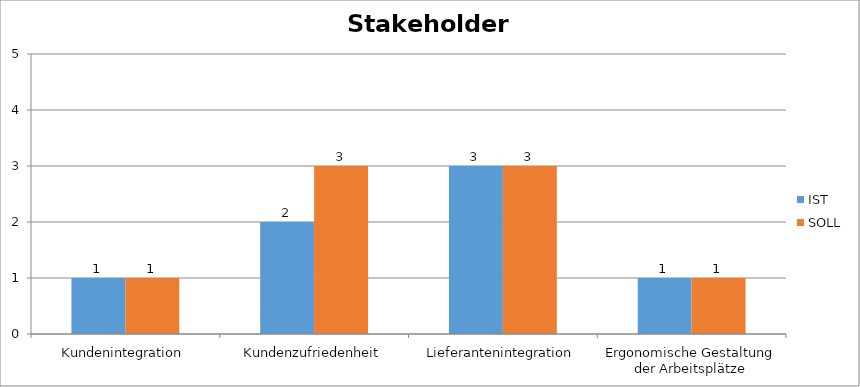
| Category | IST | SOLL |
|---|---|---|
| Kundenintegration | 1 | 1 |
| Kundenzufriedenheit | 2 | 3 |
| Lieferantenintegration | 3 | 3 |
| Ergonomische Gestaltung der Arbeitsplätze | 1 | 1 |